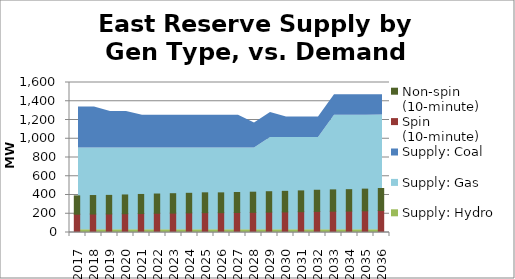
| Category | Spin
(10-minute) | Non-spin
(10-minute) |
|---|---|---|
| 0 | 195.325 | 195.325 |
| 1 | 197.17 | 197.17 |
| 2 | 197.943 | 197.943 |
| 3 | 200.211 | 200.211 |
| 4 | 202.868 | 202.868 |
| 5 | 205.22 | 205.22 |
| 6 | 206.948 | 206.948 |
| 7 | 209.042 | 209.042 |
| 8 | 211.613 | 211.613 |
| 9 | 211.414 | 211.414 |
| 10 | 213.382 | 213.382 |
| 11 | 214.967 | 214.967 |
| 12 | 217.524 | 217.524 |
| 13 | 219.495 | 219.495 |
| 14 | 221.903 | 221.903 |
| 15 | 225.369 | 225.369 |
| 16 | 227.31 | 227.31 |
| 17 | 228.483 | 228.483 |
| 18 | 231.314 | 231.314 |
| 19 | 234.57 | 234.57 |